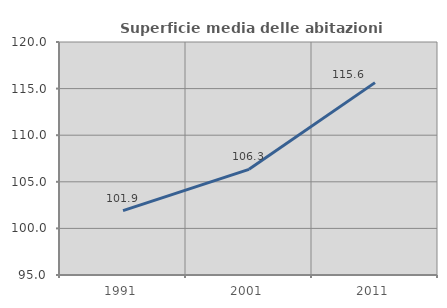
| Category | Superficie media delle abitazioni occupate |
|---|---|
| 1991.0 | 101.903 |
| 2001.0 | 106.336 |
| 2011.0 | 115.64 |